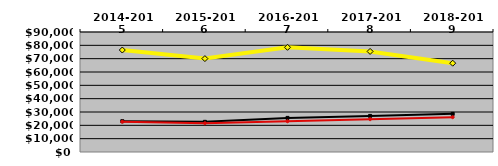
| Category | NATIONAL MEDIAN | WEST MEDIAN | TEXAS LUTHERAN |
|---|---|---|---|
| 2014-2015 | 23117.708 | 22677.301 | 76478.341 |
| 2015-2016 | 22619.893 | 21572.983 | 70047.888 |
| 2016-2017 | 25581.053 | 23057.422 | 78508.712 |
| 2017-2018 | 27067.87 | 24615.595 | 75423 |
| 2018-2019 | 28604.166 | 26115.103 | 66606.85 |